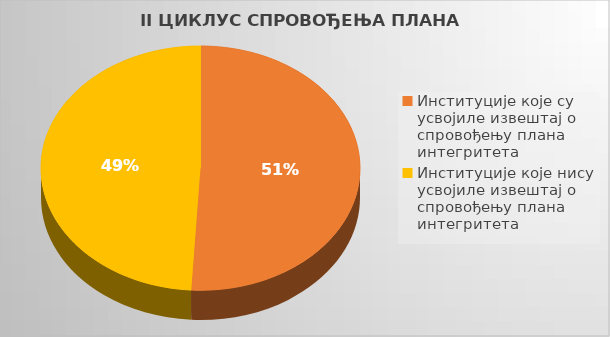
| Category | Series 0 |
|---|---|
| Институције које су усвојиле извештај о спровођењу плана интегритета | 0.509 |
| Институције које нису усвојиле извештај о спровођењу плана интегритета | 0.491 |